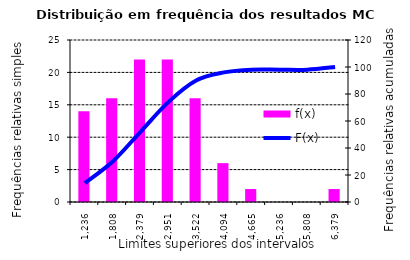
| Category | f(x) |
|---|---|
| 1236.4656538197353 | 14 |
| 1807.8737941047266 | 16 |
| 2379.281934389718 | 22 |
| 2950.6900746747096 | 22 |
| 3522.098214959701 | 16 |
| 4093.5063552446927 | 6 |
| 4664.914495529684 | 2 |
| 5236.322635814676 | 0 |
| 5807.730776099667 | 0 |
| 6379.138916384659 | 2 |